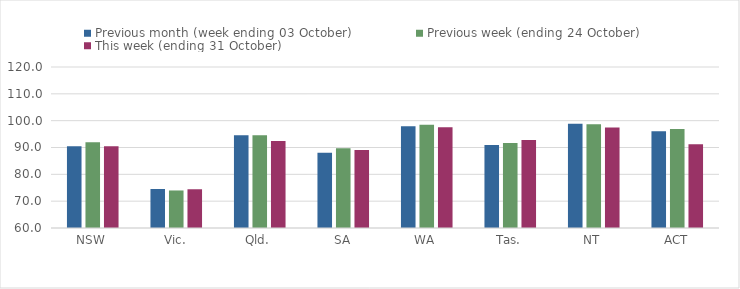
| Category | Previous month (week ending 03 October) | Previous week (ending 24 October) | This week (ending 31 October) |
|---|---|---|---|
| NSW | 90.51 | 92 | 90.47 |
| Vic. | 74.53 | 73.99 | 74.44 |
| Qld. | 94.58 | 94.59 | 92.43 |
| SA | 88 | 89.75 | 89.08 |
| WA | 97.92 | 98.5 | 97.53 |
| Tas. | 90.92 | 91.72 | 92.8 |
| NT | 98.86 | 98.67 | 97.46 |
| ACT | 96.08 | 96.86 | 91.18 |